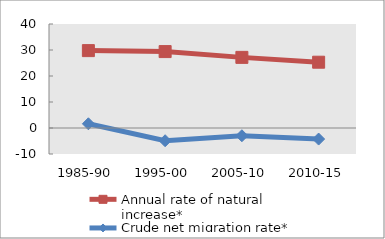
| Category | Annual rate of natural increase* | Crude net migration rate* |
|---|---|---|
| 1985-90 | 29.765 | 1.617 |
| 1995-00 | 29.393 | -4.899 |
| 2005-10 | 27.164 | -2.975 |
| 2010-15 | 25.304 | -4.252 |